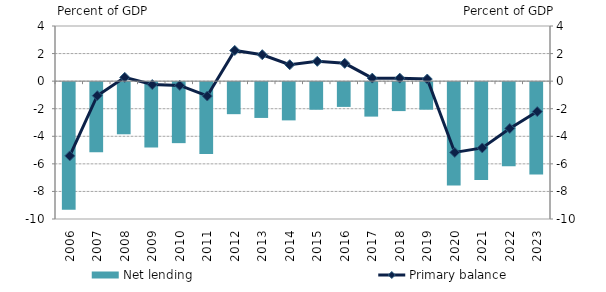
| Category | Net lending |
|---|---|
| 2006.0 | -9.257 |
| 2007.0 | -5.082 |
| 2008.0 | -3.781 |
| 2009.0 | -4.748 |
| 2010.0 | -4.425 |
| 2011.0 | -5.209 |
| 2012.0 | -2.324 |
| 2013.0 | -2.597 |
| 2014.0 | -2.774 |
| 2015.0 | -2.003 |
| 2016.0 | -1.796 |
| 2017.0 | -2.5 |
| 2018.0 | -2.1 |
| 2019.0 | -2 |
| 2020.0 | -7.5 |
| 2021.0 | -7.1 |
| 2022.0 | -6.1 |
| 2023.0 | -6.7 |